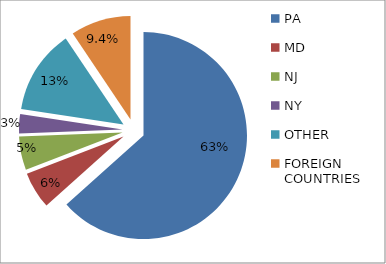
| Category | Series 1 |
|---|---|
| PA | 0.634 |
| MD | 0.058 |
| NJ | 0.052 |
| NY | 0.03 |
| OTHER | 0.132 |
| FOREIGN COUNTRIES | 0.094 |